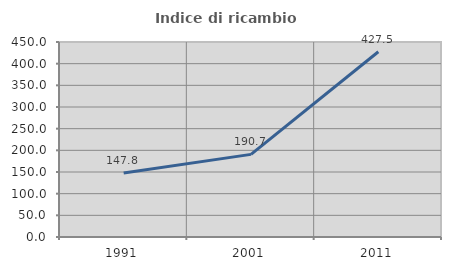
| Category | Indice di ricambio occupazionale  |
|---|---|
| 1991.0 | 147.826 |
| 2001.0 | 190.667 |
| 2011.0 | 427.5 |